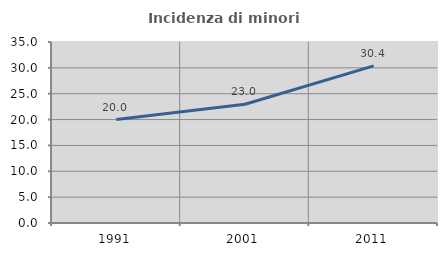
| Category | Incidenza di minori stranieri |
|---|---|
| 1991.0 | 20 |
| 2001.0 | 22.963 |
| 2011.0 | 30.383 |